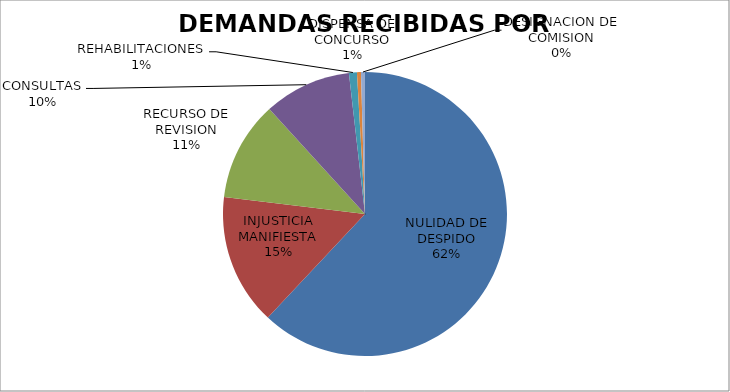
| Category | DEMANDAS RECIBIDAS POR CAUSAL  |
|---|---|
| NULIDAD DE DESPIDO | 137 |
| INJUSTICIA MANIFIESTA | 33 |
| RECURSO DE REVISION | 25 |
| CONSULTAS | 22 |
| REHABILITACIONES | 2 |
| DISPENSA DE CONCURSO | 1 |
| DESIGNACION DE COMISION | 1 |